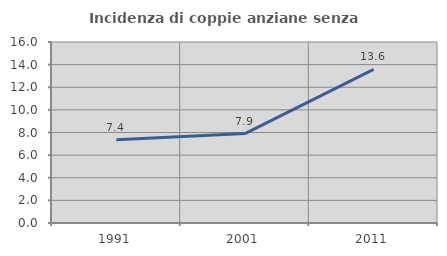
| Category | Incidenza di coppie anziane senza figli  |
|---|---|
| 1991.0 | 7.355 |
| 2001.0 | 7.906 |
| 2011.0 | 13.574 |